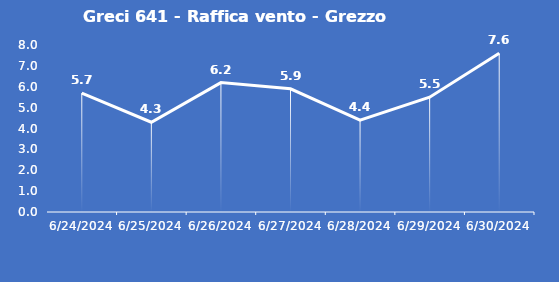
| Category | Greci 641 - Raffica vento - Grezzo (m/s) |
|---|---|
| 6/24/24 | 5.7 |
| 6/25/24 | 4.3 |
| 6/26/24 | 6.2 |
| 6/27/24 | 5.9 |
| 6/28/24 | 4.4 |
| 6/29/24 | 5.5 |
| 6/30/24 | 7.6 |